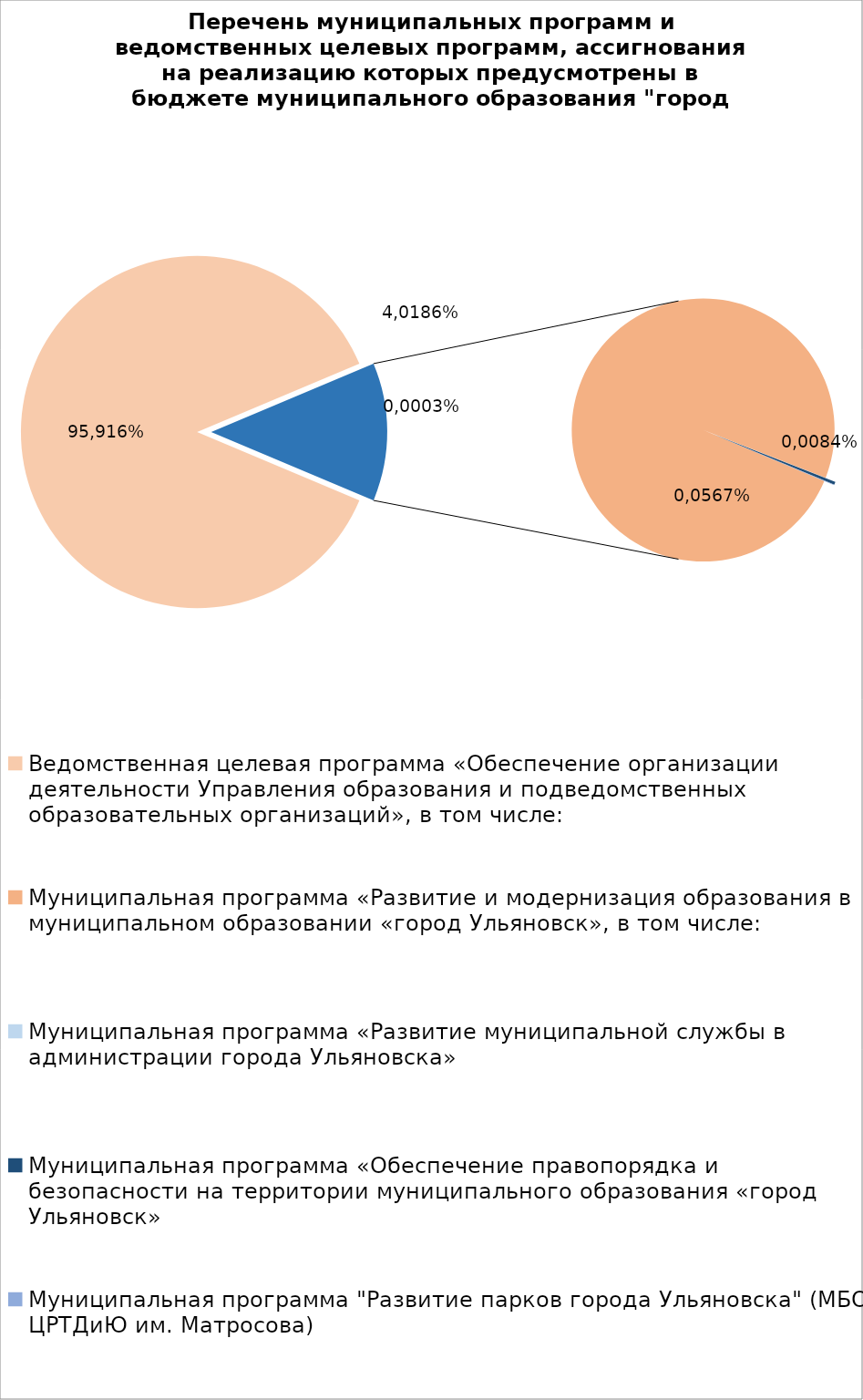
| Category | Series 0 |
|---|---|
| Ведомственная целевая программа «Обеспечение организации деятельности Управления образования и подведомственных образовательных организаций», в том числе: | 5145758.95 |
| Муниципальная программа «Развитие и модернизация образования в муниципальном образовании «город Ульяновск», в том числе: | 744975.7 |
| Муниципальная программа «Развитие муниципальной службы в администрации города Ульяновска» | 14.3 |
| Муниципальная программа «Обеспечение правопорядка и безопасности на территории муниципального образования «город Ульяновск» | 2700 |
| Муниципальная программа "Развитие парков города Ульяновска" (МБОУ ЦРТДиЮ им. Матросова) | 400 |